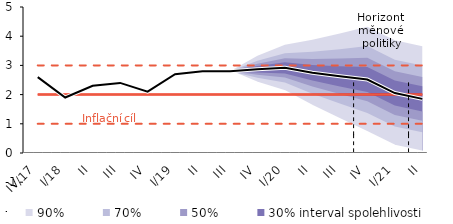
| Category | Inflation Target | Inflation Target - lower bound | Inflation Target - upper bound | linka | Střed předpovědi |
|---|---|---|---|---|---|
| IV/17 | 2 | 1 | 3 | 2.6 | 2.6 |
| I/18 | 2 | 1 | 3 | 1.9 | 1.9 |
| II | 2 | 1 | 3 | 2.3 | 2.3 |
| III | 2 | 1 | 3 | 2.4 | 2.4 |
| IV | 2 | 1 | 3 | 2.1 | 2.1 |
| I/19 | 2 | 1 | 3 | 2.7 | 2.7 |
| II | 2 | 1 | 3 | 2.8 | 2.8 |
| III | 2 | 1 | 3 | 2.8 | 2.8 |
| IV | 2 | 1 | 3 | 2.869 | 2.869 |
| I/20 | 2 | 1 | 3 | 2.915 | 2.915 |
| II | 2 | 1 | 3 | 2.749 | 2.749 |
| III | 2 | 1 | 3 | 2.625 | 2.625 |
| IV | 2 | 1 | 3 | 2.517 | 2.517 |
| I/21 | 2 | 1 | 3 | 2.053 | 2.053 |
| II | 2 | 1 | 3 | 1.854 | 1.854 |